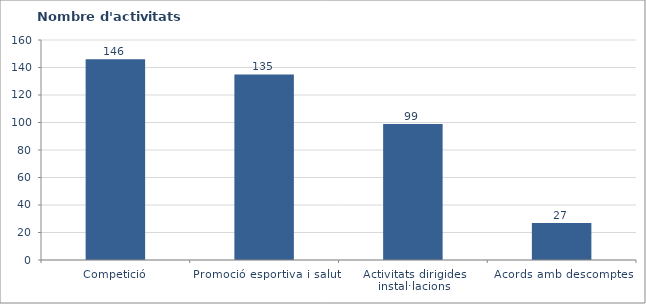
| Category | Nombre d'activitats ofertades |
|---|---|
| Competició | 146 |
| Promoció esportiva i salut | 135 |
| Activitats dirigides instal·lacions | 99 |
| Acords amb descomptes | 27 |